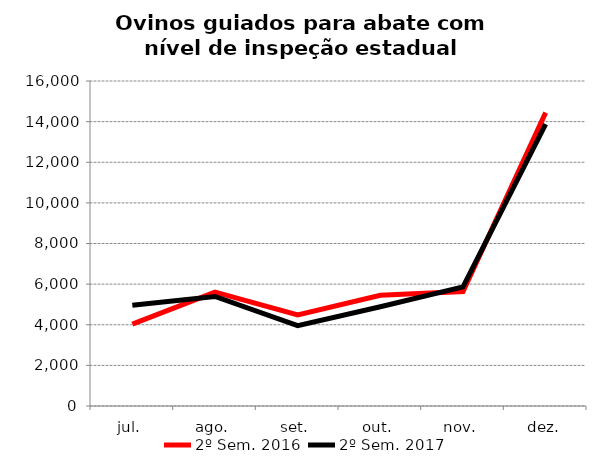
| Category | 2º Sem. 2016 | 2º Sem. 2017 |
|---|---|---|
| jul. | 4028 | 4958 |
| ago. | 5604 | 5392 |
| set. | 4480 | 3954 |
| out. | 5455 | 4885 |
| nov. | 5636 | 5861 |
| dez. | 14442 | 13879 |